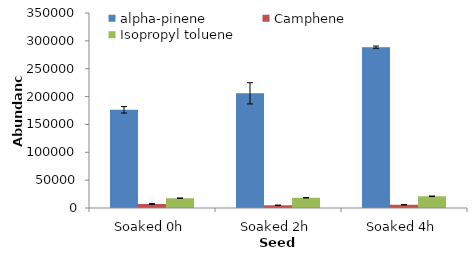
| Category | alpha-pinene | Camphene | Isopropyl toluene |
|---|---|---|---|
| Soaked 0h | 176226.833 | 7221.167 | 17553.333 |
| Soaked 2h | 205792.667 | 4855.333 | 18379.5 |
| Soaked 4h | 288709 | 5817.167 | 21034.167 |